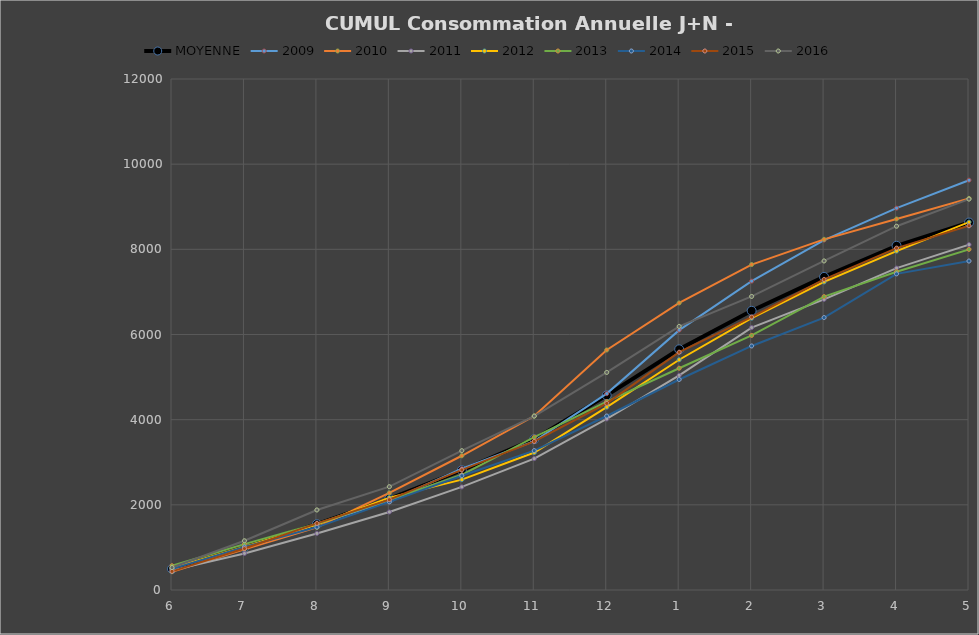
| Category | MOYENNE | 2009 | 2010 | 2011 | 2012 | 2013 | 2014 | 2015 | 2016 |
|---|---|---|---|---|---|---|---|---|---|
| 6 | 494.875 | 521.471 | 430.25 | 461 | 519.812 | 570 | 492.5 | 438 | 526.923 |
| 7 | 1002.875 | 971.382 | 956.714 | 857.972 | 1018.3 | 1078 | 1011 | 973 | 1156.778 |
| 8 | 1545.125 | 1545.079 | 1470 | 1328.467 | 1537.75 | 1555.714 | 1477.632 | 1565.78 | 1879.643 |
| 9 | 2138.5 | 2090.618 | 2280.909 | 1832.133 | 2169.375 | 2117 | 2070 | 2121.8 | 2426 |
| 10 | 2812 | 2848.18 | 3152.533 | 2421.1 | 2592 | 2705.031 | 2684 | 2820.63 | 3272 |
| 11 | 3541.625 | 3496.118 | 4084.875 | 3085.536 | 3228 | 3590 | 3274 | 3489.484 | 4084.727 |
| 12 | 4570.125 | 4611.618 | 5636.345 | 4017.375 | 4294 | 4424 | 4085.636 | 4381.548 | 5110 |
| 1 | 5652 | 6102.618 | 6740.567 | 5040 | 5407 | 5208 | 4943.233 | 5584.097 | 6190.441 |
| 2 | 6556.75 | 7253.418 | 7642.6 | 6162.4 | 6383.387 | 5978 | 5731 | 6410 | 6894 |
| 3 | 7352.625 | 8217.618 | 8234.6 | 6824 | 7235 | 6890 | 6397.8 | 7293.5 | 7727.242 |
| 4 | 8083.625 | 8966.68 | 8712.75 | 7560 | 7958 | 7475 | 7424 | 8028.633 | 8543 |
| 5 | 8628.625 | 9623.618 | 9196 | 8111 | 8640 | 7999 | 7725 | 8554 | 9180 |